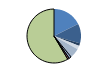
| Category | Series 0 |
|---|---|
| ARRASTRE | 220 |
| CERCO | 147 |
| ATUNEROS CAÑEROS | 20 |
| PALANGRE DE FONDO | 27 |
| PALANGRE DE SUPERFICIE | 66 |
| RASCO | 9 |
| VOLANTA | 17 |
| ARTES FIJAS | 12 |
| ARTES MENORES | 731 |